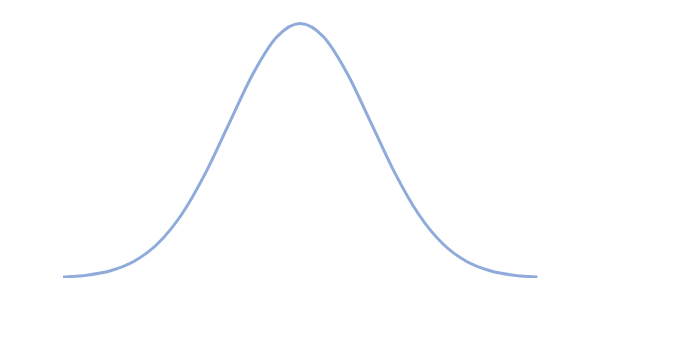
| Category | Series 0 |
|---|---|
| 0.0 | 0.005 |
| 0.1 | 0.015 |
| 0.2 | 0.038 |
| 0.3 | 0.087 |
| 0.4 | 0.18 |
| 0.5 | 0.332 |
| 0.6 | 0.547 |
| 0.7 | 0.807 |
| 0.8 | 1.065 |
| 0.9 | 1.258 |
| 1.0 | 1.33 |
| 1.1 | 1.258 |
| 1.2 | 1.065 |
| 1.3 | 0.807 |
| 1.4 | 0.547 |
| 1.5 | 0.332 |
| 1.6 | 0.18 |
| 1.7 | 0.087 |
| 1.8 | 0.038 |
| 1.9 | 0.015 |
| 2.0 | 0.005 |